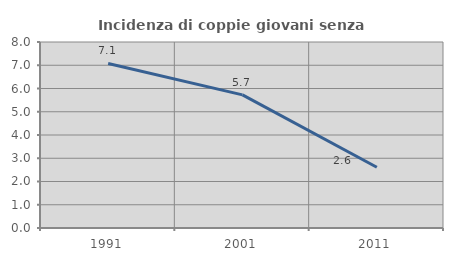
| Category | Incidenza di coppie giovani senza figli |
|---|---|
| 1991.0 | 7.076 |
| 2001.0 | 5.724 |
| 2011.0 | 2.614 |